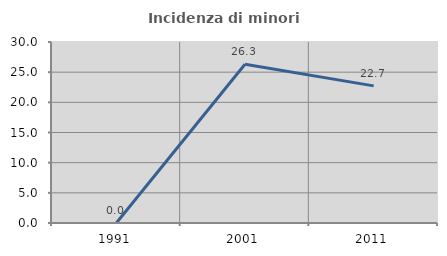
| Category | Incidenza di minori stranieri |
|---|---|
| 1991.0 | 0 |
| 2001.0 | 26.316 |
| 2011.0 | 22.727 |